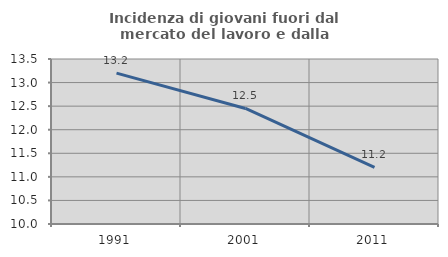
| Category | Incidenza di giovani fuori dal mercato del lavoro e dalla formazione  |
|---|---|
| 1991.0 | 13.2 |
| 2001.0 | 12.451 |
| 2011.0 | 11.203 |